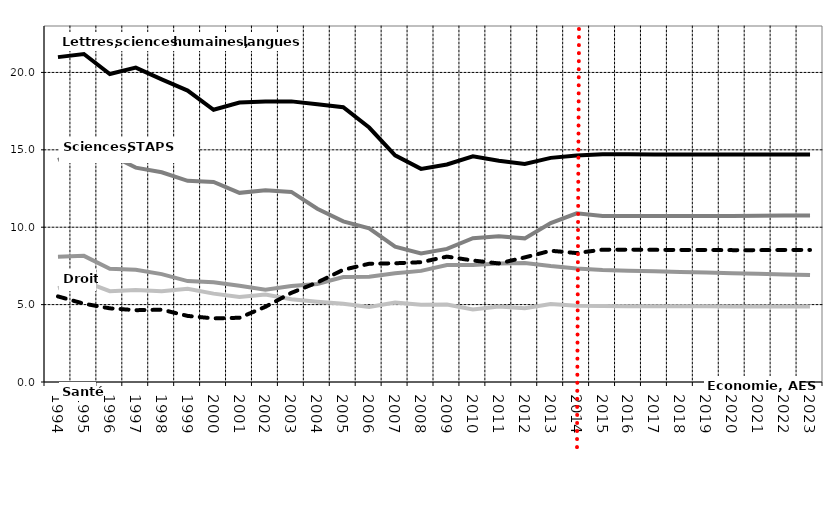
| Category | Droit | Economie | Lettres | Sciences | Santé |
|---|---|---|---|---|---|
| 1994.0 | 8.09 | 6.06 | 20.99 | 14.34 | 5.53 |
| 1995.0 | 8.15 | 6.5 | 21.19 | 15.07 | 5.06 |
| 1996.0 | 7.32 | 5.87 | 19.9 | 14.68 | 4.76 |
| 1997.0 | 7.25 | 5.95 | 20.31 | 13.85 | 4.64 |
| 1998.0 | 6.97 | 5.87 | 19.55 | 13.55 | 4.67 |
| 1999.0 | 6.52 | 6.03 | 18.83 | 13 | 4.27 |
| 2000.0 | 6.44 | 5.71 | 17.59 | 12.92 | 4.11 |
| 2001.0 | 6.22 | 5.5 | 18.06 | 12.22 | 4.15 |
| 2002.0 | 5.96 | 5.65 | 18.12 | 12.39 | 4.86 |
| 2003.0 | 6.2 | 5.35 | 18.13 | 12.28 | 5.76 |
| 2004.0 | 6.33 | 5.19 | 17.95 | 11.19 | 6.43 |
| 2005.0 | 6.78 | 5.06 | 17.75 | 10.38 | 7.25 |
| 2006.0 | 6.8 | 4.84 | 16.44 | 9.93 | 7.64 |
| 2007.0 | 7.02 | 5.14 | 14.64 | 8.74 | 7.67 |
| 2008.0 | 7.18 | 4.99 | 13.77 | 8.31 | 7.74 |
| 2009.0 | 7.56 | 5.01 | 14.05 | 8.6 | 8.1 |
| 2010.0 | 7.56 | 4.69 | 14.58 | 9.29 | 7.85 |
| 2011.0 | 7.65 | 4.88 | 14.29 | 9.41 | 7.66 |
| 2012.0 | 7.69 | 4.77 | 14.09 | 9.28 | 8.05 |
| 2013.0 | 7.49 | 5.04 | 14.48 | 10.27 | 8.48 |
| 2014.0 | 7.33 | 4.92 | 14.64 | 10.9 | 8.33 |
| 2015.0 | 7.24 | 4.91 | 14.71 | 10.72 | 8.55 |
| 2016.0 | 7.19 | 4.9 | 14.71 | 10.72 | 8.55 |
| 2017.0 | 7.15 | 4.9 | 14.7 | 10.72 | 8.54 |
| 2018.0 | 7.11 | 4.89 | 14.69 | 10.72 | 8.53 |
| 2019.0 | 7.07 | 4.89 | 14.69 | 10.73 | 8.53 |
| 2020.0 | 7.03 | 4.88 | 14.69 | 10.73 | 8.52 |
| 2021.0 | 6.99 | 4.88 | 14.69 | 10.74 | 8.52 |
| 2022.0 | 6.95 | 4.88 | 14.69 | 10.75 | 8.53 |
| 2023.0 | 6.91 | 4.87 | 14.69 | 10.76 | 8.53 |